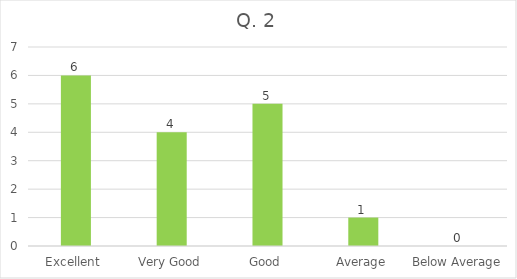
| Category | Series 0 |
|---|---|
| Excellent  | 6 |
| Very Good | 4 |
| Good | 5 |
| Average | 1 |
| Below Average | 0 |